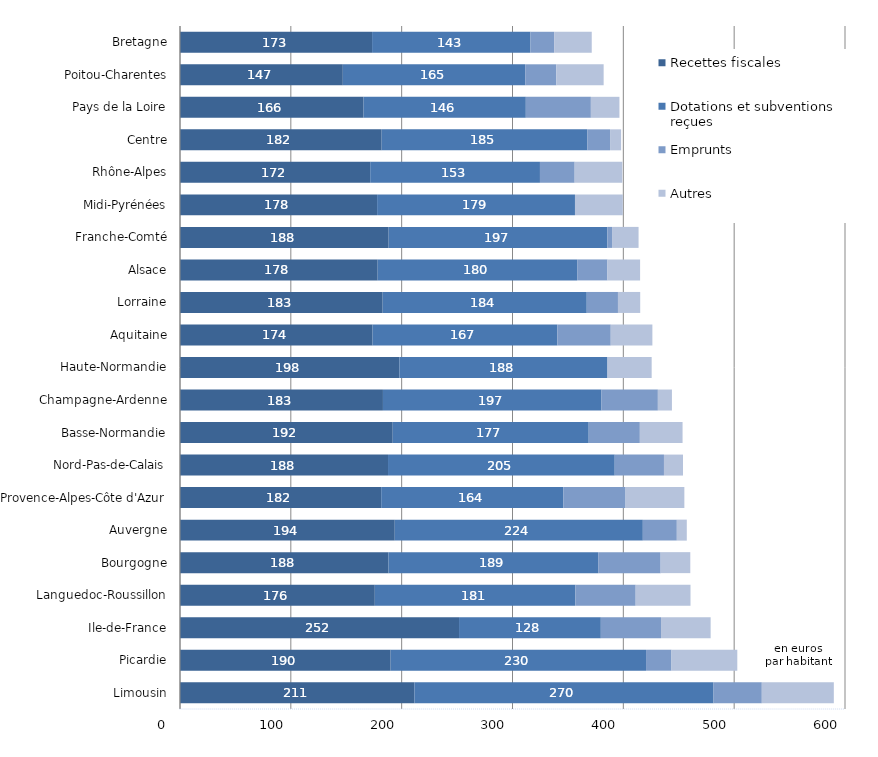
| Category | Recettes fiscales | Dotations et subventions reçues | Emprunts | Autres |
|---|---|---|---|---|
| Limousin | 211.489 | 269.898 | 43.557 | 64.976 |
| Picardie | 190.053 | 230.425 | 22.976 | 59.373 |
| Ile-de-France | 251.778 | 127.917 | 54.306 | 44.768 |
| Languedoc-Roussillon | 175.768 | 180.905 | 54.467 | 49.463 |
| Bourgogne | 188.111 | 189.203 | 56.345 | 26.752 |
| Auvergne | 193.761 | 223.836 | 30.671 | 8.992 |
| Provence-Alpes-Côte d'Azur | 181.539 | 164.263 | 56.209 | 53.046 |
| Nord-Pas-de-Calais | 187.691 | 204.555 | 44.414 | 17.153 |
| Basse-Normandie | 191.929 | 176.838 | 46.135 | 38.541 |
| Champagne-Ardenne | 183.112 | 197.178 | 50.871 | 12.689 |
| Haute-Normandie | 198.023 | 187.679 | 0.001 | 39.86 |
| Aquitaine | 173.727 | 166.678 | 48.241 | 37.562 |
| Lorraine | 182.852 | 184.155 | 28.146 | 20.064 |
| Alsace | 178.345 | 180.01 | 27.327 | 29.438 |
| Franche-Comté | 188.246 | 197.404 | 4.151 | 23.943 |
| Midi-Pyrénées | 177.846 | 178.524 | 0 | 43.13 |
| Rhône-Alpes | 171.617 | 153.153 | 31.318 | 43.025 |
| Centre | 181.942 | 185.48 | 20.614 | 9.97 |
| Pays de la Loire | 165.611 | 146.421 | 58.68 | 25.776 |
| Poitou-Charentes | 146.905 | 164.575 | 28.115 | 42.638 |
| Bretagne | 173.307 | 142.914 | 21.362 | 33.915 |